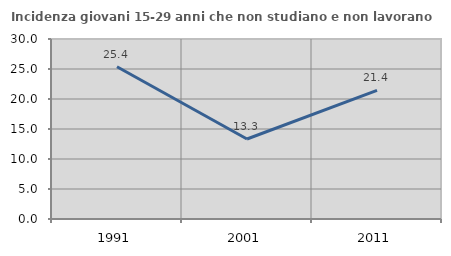
| Category | Incidenza giovani 15-29 anni che non studiano e non lavorano  |
|---|---|
| 1991.0 | 25.373 |
| 2001.0 | 13.333 |
| 2011.0 | 21.429 |